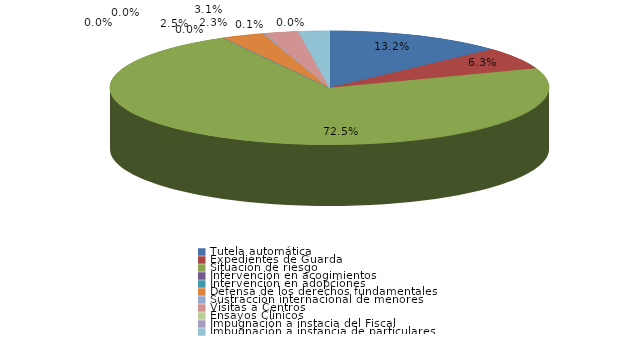
| Category | Series 0 |
|---|---|
| Tutela automática | 105 |
| Expedientes de Guarda | 50 |
| Situación de riesgo | 578 |
| Intervención en acogimientos | 0 |
| Intervención en adopciones | 0 |
| Defensa de los derechos fundamentales | 25 |
| Sustracción internacional de menores | 1 |
| Visitas a Centros | 20 |
| Ensayos Clínicos | 0 |
| Impugnación a instacia del Fiscal | 0 |
| Impugnación a instancia de particulares | 18 |